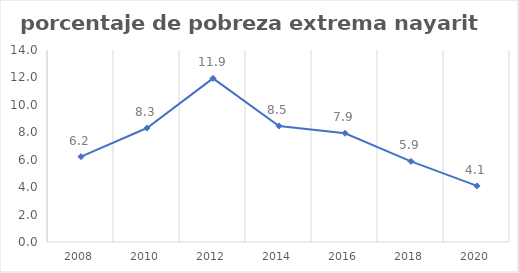
| Category | Series 0 |
|---|---|
| 2008.0 | 6.221 |
| 2010.0 | 8.31 |
| 2012.0 | 11.932 |
| 2014.0 | 8.463 |
| 2016.0 | 7.93 |
| 2018.0 | 5.879 |
| 2020.0 | 4.092 |